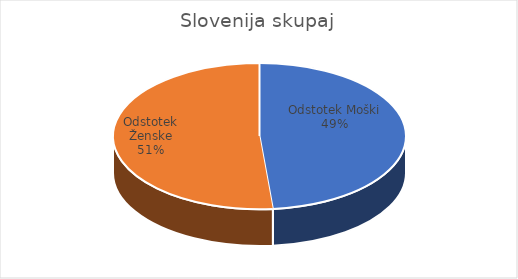
| Category | Slovenija skupaj |
|---|---|
| Odstotek Moški | 13.7 |
| Odstotek Ženske | 14.52 |